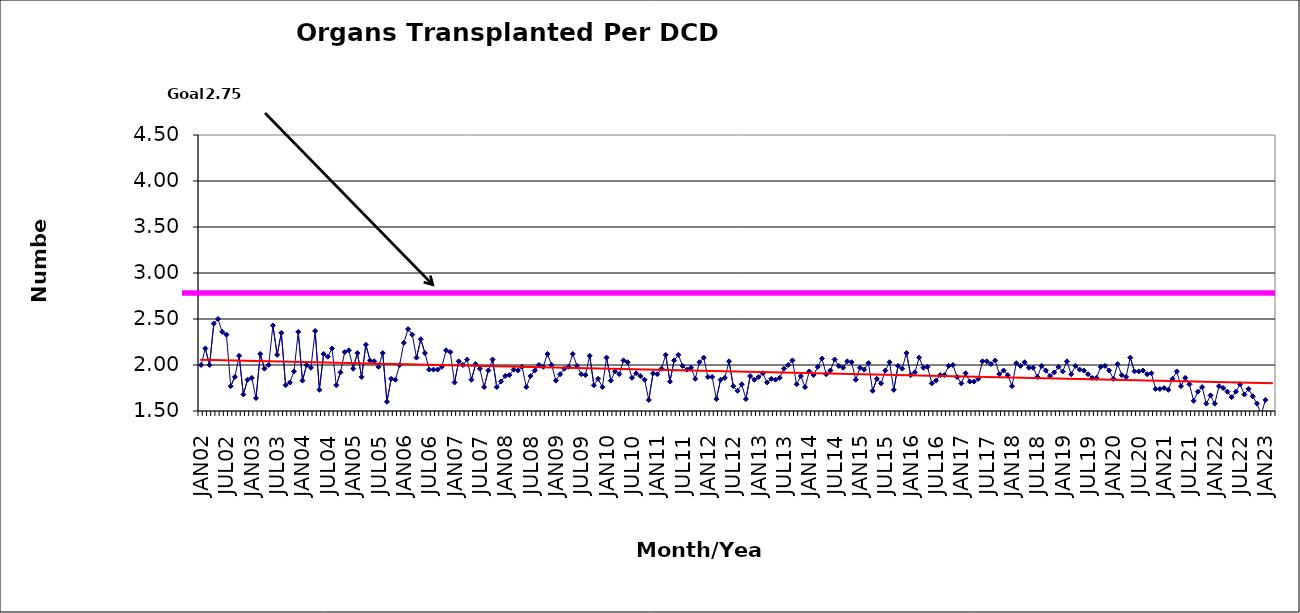
| Category | Series 0 |
|---|---|
| JAN02 | 2 |
| FEB02 | 2.18 |
| MAR02 | 2 |
| APR02 | 2.45 |
| MAY02 | 2.5 |
| JUN02 | 2.36 |
| JUL02 | 2.33 |
| AUG02 | 1.77 |
| SEP02 | 1.87 |
| OCT02 | 2.1 |
| NOV02 | 1.68 |
| DEC02 | 1.84 |
| JAN03 | 1.86 |
| FEB03 | 1.64 |
| MAR03 | 2.12 |
| APR03 | 1.96 |
| MAY03 | 2 |
| JUN03 | 2.43 |
| JUL03 | 2.11 |
| AUG03 | 2.35 |
| SEP03 | 1.78 |
| OCT03 | 1.81 |
| NOV03 | 1.93 |
| DEC03 | 2.36 |
| JAN04 | 1.83 |
| FEB04 | 2 |
| MAR04 | 1.97 |
| APR04 | 2.37 |
| MAY04 | 1.73 |
| JUN04 | 2.12 |
| JUL04 | 2.09 |
| AUG04 | 2.18 |
| SEP04 | 1.78 |
| OCT04 | 1.92 |
| NOV04 | 2.14 |
| DEC04 | 2.16 |
| JAN05 | 1.96 |
| FEB05 | 2.13 |
| MAR05 | 1.87 |
| APR05 | 2.22 |
| MAY05 | 2.05 |
| JUN05 | 2.04 |
| JUL05 | 1.98 |
| AUG05 | 2.13 |
| SEP05 | 1.6 |
| OCT05 | 1.85 |
| NOV05 | 1.84 |
| DEC05 | 2 |
| JAN06 | 2.24 |
| FEB06 | 2.39 |
| MAR06 | 2.33 |
| APR06 | 2.08 |
| MAY06 | 2.28 |
| JUN06 | 2.13 |
| JUL06 | 1.95 |
| AUG06 | 1.95 |
| SEP06 | 1.95 |
| OCT06 | 1.98 |
| NOV06 | 2.16 |
| DEC06 | 2.14 |
| JAN07 | 1.81 |
| FEB07 | 2.04 |
| MAR07 | 2 |
| APR07 | 2.06 |
| MAY07 | 1.84 |
| JUN07 | 2.01 |
| JUL07 | 1.96 |
| AUG07 | 1.76 |
| SEP07 | 1.94 |
| OCT07 | 2.06 |
| NOV07 | 1.76 |
| DEC07 | 1.82 |
| JAN08 | 1.88 |
| FEB08 | 1.89 |
| MAR08 | 1.95 |
| APR08 | 1.94 |
| MAY08 | 1.98 |
| JUN08 | 1.76 |
| JUL08 | 1.88 |
| AUG08 | 1.94 |
| SEP08 | 2 |
| OCT08 | 1.98 |
| NOV08 | 2.12 |
| DEC08 | 2 |
| JAN09 | 1.83 |
| FEB09 | 1.9 |
| MAR09 | 1.96 |
| APR09 | 1.98 |
| MAY09 | 2.12 |
| JUN09 | 1.99 |
| JUL09 | 1.9 |
| AUG09 | 1.89 |
| SEP09 | 2.1 |
| OCT09 | 1.78 |
| NOV09 | 1.85 |
| DEC09 | 1.76 |
| JAN10 | 2.08 |
| FEB10 | 1.83 |
| MAR10 | 1.93 |
| APR10 | 1.9 |
| MAY10 | 2.05 |
| JUN10 | 2.03 |
| JUL10 | 1.86 |
| AUG10 | 1.91 |
| SEP10 | 1.88 |
| OCT10 | 1.84 |
| NOV10 | 1.62 |
| DEC10 | 1.91 |
| JAN11 | 1.9 |
| FEB11 | 1.96 |
| MAR11 | 2.11 |
| APR11 | 1.82 |
| MAY11 | 2.05 |
| JUN11 | 2.11 |
| JUL11 | 1.99 |
| AUG11 | 1.95 |
| SEP11 | 1.97 |
| OCT11 | 1.85 |
| NOV11 | 2.03 |
| DEC11 | 2.08 |
| JAN12 | 1.87 |
| FEB12 | 1.87 |
| MAR12 | 1.63 |
| APR12 | 1.84 |
| MAY12 | 1.86 |
| JUN12 | 2.04 |
| JUL12 | 1.77 |
| AUG12 | 1.72 |
| SEP12 | 1.79 |
| OCT12 | 1.63 |
| NOV12 | 1.88 |
| DEC12 | 1.84 |
| JAN13 | 1.87 |
| FEB13 | 1.91 |
| MAR13 | 1.81 |
| APR13 | 1.85 |
| MAY13 | 1.84 |
| JUN13 | 1.86 |
| JUL13 | 1.96 |
| AUG13 | 2 |
| SEP13 | 2.05 |
| OCT13 | 1.79 |
| NOV13 | 1.88 |
| DEC13 | 1.76 |
| JAN14 | 1.93 |
| FEB14 | 1.89 |
| MAR14 | 1.98 |
| APR14 | 2.07 |
| MAY14 | 1.9 |
| JUN14 | 1.94 |
| JUL14 | 2.06 |
| AUG14 | 1.99 |
| SEP14 | 1.97 |
| OCT14 | 2.04 |
| NOV14 | 2.03 |
| DEC14 | 1.84 |
| JAN15 | 1.97 |
| FEB15 | 1.95 |
| MAR15 | 2.02 |
| APR15 | 1.72 |
| MAY15 | 1.85 |
| JUN15 | 1.8 |
| JUL15 | 1.94 |
| AUG15 | 2.03 |
| SEP15 | 1.73 |
| OCT15 | 1.99 |
| NOV15 | 1.96 |
| DEC15 | 2.13 |
| JAN16 | 1.89 |
| FEB16 | 1.92 |
| MAR16 | 2.08 |
| APR16 | 1.97 |
| MAY16 | 1.98 |
| JUN16 | 1.8 |
| JUL16 | 1.83 |
| AUG16 | 1.89 |
| SEP16 | 1.89 |
| OCT16 | 1.99 |
| NOV16 | 2 |
| DEC16 | 1.87 |
| JAN17 | 1.8 |
| FEB17 | 1.91 |
| MAR17 | 1.82 |
| APR17 | 1.82 |
| MAY17 | 1.85 |
| JUN17 | 2.04 |
| JUL17 | 2.04 |
| AUG17 | 2.01 |
| SEP17 | 2.05 |
| OCT17 | 1.9 |
| NOV17 | 1.94 |
| DEC17 | 1.89 |
| JAN18 | 1.77 |
| FEB18 | 2.02 |
| MAR18 | 1.99 |
| APR18 | 2.03 |
| MAY18 | 1.97 |
| JUN18 | 1.97 |
| JUL18 | 1.87 |
| AUG18 | 1.99 |
| SEP18 | 1.94 |
| OCT18 | 1.88 |
| NOV18 | 1.92 |
| DEC18 | 1.98 |
| JAN19 | 1.93 |
| FEB19 | 2.04 |
| MAR19 | 1.9 |
| APR19 | 1.99 |
| MAY19 | 1.95 |
| JUN19 | 1.94 |
| JUL19 | 1.9 |
| AUG19 | 1.86 |
| SEP19 | 1.86 |
| OCT19 | 1.98 |
| NOV19 | 1.99 |
| DEC19 | 1.94 |
| JAN20 | 1.85 |
| FEB20 | 2.01 |
| MAR20 | 1.89 |
| APR20 | 1.87 |
| MAY20 | 2.08 |
| JUN20 | 1.93 |
| JUL20 | 1.93 |
| AUG20 | 1.94 |
| SEP20 | 1.9 |
| OCT20 | 1.91 |
| NOV20 | 1.74 |
| DEC20 | 1.74 |
| JAN21 | 1.75 |
| FEB21 | 1.73 |
| MAR21 | 1.85 |
| APR21 | 1.93 |
| MAY21 | 1.77 |
| JUN21 | 1.86 |
| JUL21 | 1.79 |
| AUG21 | 1.61 |
| SEP21 | 1.71 |
| OCT21 | 1.76 |
| NOV21 | 1.58 |
| DEC21 | 1.67 |
| JAN22 | 1.58 |
| FEB22 | 1.77 |
| MAR22 | 1.75 |
| APR22 | 1.71 |
| MAY22 | 1.65 |
| JUN22 | 1.71 |
| JUL22 | 1.79 |
| AUG22 | 1.68 |
| SEP22 | 1.74 |
| OCT22 | 1.66 |
| NOV22 | 1.58 |
| DEC22 | 1.46 |
| JAN23 | 1.62 |